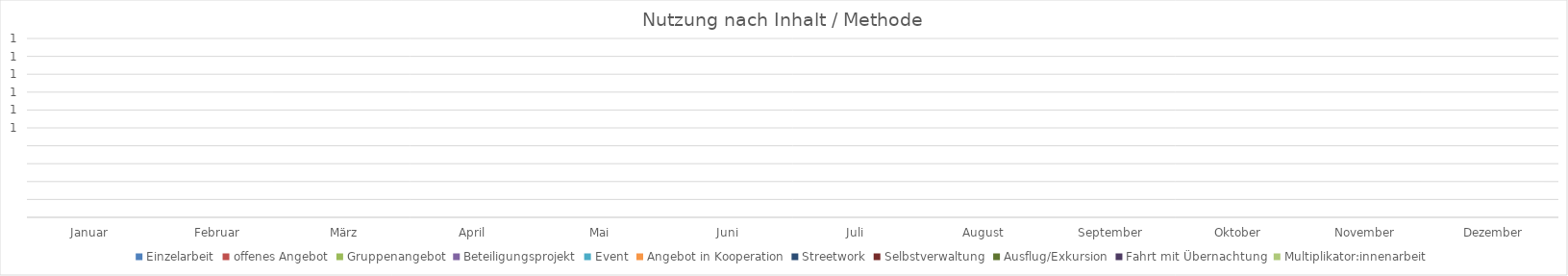
| Category | Einzelarbeit | offenes Angebot | Gruppenangebot | Beteiligungsprojekt | Event | Angebot in Kooperation | Streetwork | Selbstverwaltung | Ausflug/Exkursion | Fahrt mit Übernachtung | Multiplikator:innenarbeit |
|---|---|---|---|---|---|---|---|---|---|---|---|
| Januar | 0 | 0 | 0 | 0 | 0 | 0 | 0 | 0 | 0 | 0 | 0 |
| Februar | 0 | 0 | 0 | 0 | 0 | 0 | 0 | 0 | 0 | 0 | 0 |
| März | 0 | 0 | 0 | 0 | 0 | 0 | 0 | 0 | 0 | 0 | 0 |
| April | 0 | 0 | 0 | 0 | 0 | 0 | 0 | 0 | 0 | 0 | 0 |
| Mai | 0 | 0 | 0 | 0 | 0 | 0 | 0 | 0 | 0 | 0 | 0 |
| Juni | 0 | 0 | 0 | 0 | 0 | 0 | 0 | 0 | 0 | 0 | 0 |
| Juli | 0 | 0 | 0 | 0 | 0 | 0 | 0 | 0 | 0 | 0 | 0 |
| August | 0 | 0 | 0 | 0 | 0 | 0 | 0 | 0 | 0 | 0 | 0 |
| September | 0 | 0 | 0 | 0 | 0 | 0 | 0 | 0 | 0 | 0 | 0 |
| Oktober | 0 | 0 | 0 | 0 | 0 | 0 | 0 | 0 | 0 | 0 | 0 |
| November | 0 | 0 | 0 | 0 | 0 | 0 | 0 | 0 | 0 | 0 | 0 |
| Dezember | 0 | 0 | 0 | 0 | 0 | 0 | 0 | 0 | 0 | 0 | 0 |